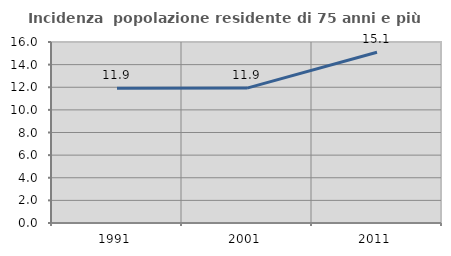
| Category | Incidenza  popolazione residente di 75 anni e più |
|---|---|
| 1991.0 | 11.911 |
| 2001.0 | 11.923 |
| 2011.0 | 15.089 |